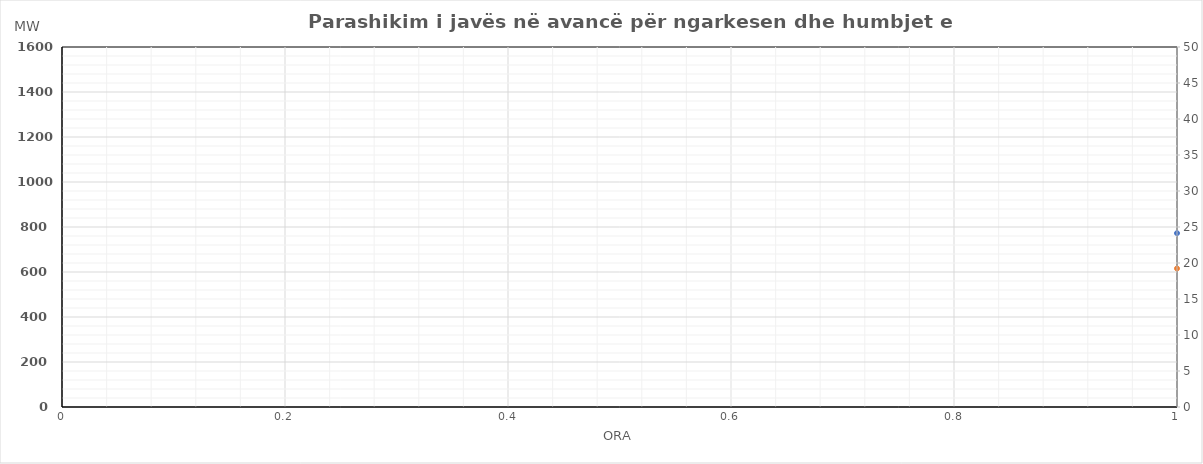
| Category | Ngarkesa (MWh) |
|---|---|
| 0 | 615.56 |
| 1 | 549.46 |
| 2 | 526.86 |
| 3 | 530.03 |
| 4 | 527.72 |
| 5 | 607.01 |
| 6 | 779.42 |
| 7 | 988.53 |
| 8 | 1030.64 |
| 9 | 1016.04 |
| 10 | 973.96 |
| 11 | 855.59 |
| 12 | 851.43 |
| 13 | 801.51 |
| 14 | 824.7 |
| 15 | 873.13 |
| 16 | 956.97 |
| 17 | 1059.61 |
| 18 | 1129.94 |
| 19 | 1115.82 |
| 20 | 1069.79 |
| 21 | 955.97 |
| 22 | 838.08 |
| 23 | 690.87 |
| 24 | 601.1 |
| 25 | 547.01 |
| 26 | 530.59 |
| 27 | 529.49 |
| 28 | 539.69 |
| 29 | 592.68 |
| 30 | 737.51 |
| 31 | 947.75 |
| 32 | 1020.95 |
| 33 | 1026.12 |
| 34 | 1019.01 |
| 35 | 985.2 |
| 36 | 994.86 |
| 37 | 994.1 |
| 38 | 1009.34 |
| 39 | 1019.74 |
| 40 | 1108.51 |
| 41 | 1172.01 |
| 42 | 1154.97 |
| 43 | 1137.77 |
| 44 | 1114.04 |
| 45 | 1011.89 |
| 46 | 853.88 |
| 47 | 695.91 |
| 48 | 590.42 |
| 49 | 540.08 |
| 50 | 515.3 |
| 51 | 504.82 |
| 52 | 511.03 |
| 53 | 563.81 |
| 54 | 687.13 |
| 55 | 854.05 |
| 56 | 979.05 |
| 57 | 1008.49 |
| 58 | 1009.08 |
| 59 | 1010.69 |
| 60 | 946.72 |
| 61 | 952.96 |
| 62 | 1041.94 |
| 63 | 1057.5 |
| 64 | 1267.71 |
| 65 | 1336.38 |
| 66 | 1320.36 |
| 67 | 1294.84 |
| 68 | 1108.11 |
| 69 | 1007.94 |
| 70 | 868.2 |
| 71 | 729.75 |
| 72 | 625.91 |
| 73 | 559.82 |
| 74 | 539.56 |
| 75 | 509.36 |
| 76 | 526.24 |
| 77 | 580.62 |
| 78 | 696.86 |
| 79 | 869.05 |
| 80 | 981.11 |
| 81 | 1015.42 |
| 82 | 988.45 |
| 83 | 974.55 |
| 84 | 977.74 |
| 85 | 1001.56 |
| 86 | 1012.41 |
| 87 | 1050.63 |
| 88 | 1180.81 |
| 89 | 1301.31 |
| 90 | 1315.24 |
| 91 | 1314.18 |
| 92 | 1251.75 |
| 93 | 1123.57 |
| 94 | 951.19 |
| 95 | 766.93 |
| 96 | 582.52 |
| 97 | 529.27 |
| 98 | 501.62 |
| 99 | 494.64 |
| 100 | 503.02 |
| 101 | 562.67 |
| 102 | 696.33 |
| 103 | 870.41 |
| 104 | 995.52 |
| 105 | 1020.19 |
| 106 | 1012.71 |
| 107 | 1033.46 |
| 108 | 1038.96 |
| 109 | 1068.08 |
| 110 | 1089.34 |
| 111 | 1146.85 |
| 112 | 1204.09 |
| 113 | 1290.33 |
| 114 | 1275.15 |
| 115 | 1301.78 |
| 116 | 1240.39 |
| 117 | 1115.71 |
| 118 | 912.99 |
| 119 | 761.74 |
| 120 | 630.46 |
| 121 | 576.76 |
| 122 | 554.26 |
| 123 | 544.33 |
| 124 | 551.52 |
| 125 | 601.81 |
| 126 | 719.92 |
| 127 | 870.53 |
| 128 | 1012.64 |
| 129 | 1080.84 |
| 130 | 1103.66 |
| 131 | 1119.89 |
| 132 | 1102.43 |
| 133 | 1124.01 |
| 134 | 1119.7 |
| 135 | 1112.83 |
| 136 | 1178.07 |
| 137 | 1261.21 |
| 138 | 1235.54 |
| 139 | 1186.02 |
| 140 | 1131.99 |
| 141 | 1037.07 |
| 142 | 910.88 |
| 143 | 784.77 |
| 144 | 656.86 |
| 145 | 601.91 |
| 146 | 578.51 |
| 147 | 576.76 |
| 148 | 576.32 |
| 149 | 628.46 |
| 150 | 750.11 |
| 151 | 910.26 |
| 152 | 1055.13 |
| 153 | 1159.75 |
| 154 | 1181.88 |
| 155 | 1210.63 |
| 156 | 1191.66 |
| 157 | 1102.35 |
| 158 | 1107.65 |
| 159 | 1111.79 |
| 160 | 1168.46 |
| 161 | 1268.31 |
| 162 | 1213.49 |
| 163 | 1182.69 |
| 164 | 1165.39 |
| 165 | 1023.9 |
| 166 | 895.33 |
| 167 | 766.22 |